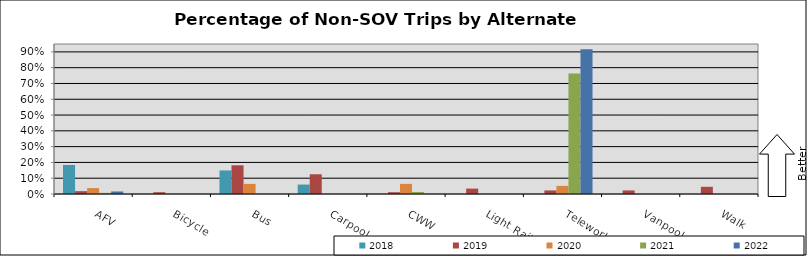
| Category | 2018 | 2019 | 2020 | 2021 | 2022 |
|---|---|---|---|---|---|
| AFV | 0.184 | 0.018 | 0.037 | 0.007 | 0.016 |
| Bicycle | 0 | 0.011 | 0 | 0 | 0 |
| Bus | 0.149 | 0.182 | 0.064 | 0 | 0 |
| Carpool | 0.06 | 0.125 | 0 | 0 | 0 |
| CWW | 0 | 0.011 | 0.064 | 0.012 | 0 |
| Light Rail | 0 | 0.034 | 0 | 0 | 0 |
| Telework | 0 | 0.023 | 0.051 | 0.762 | 0.917 |
| Vanpool | 0 | 0.023 | 0 | 0 | 0 |
| Walk | 0 | 0.046 | 0 | 0 | 0 |